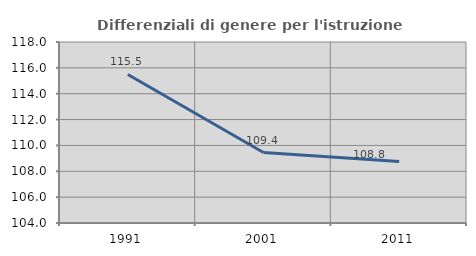
| Category | Differenziali di genere per l'istruzione superiore |
|---|---|
| 1991.0 | 115.491 |
| 2001.0 | 109.448 |
| 2011.0 | 108.752 |